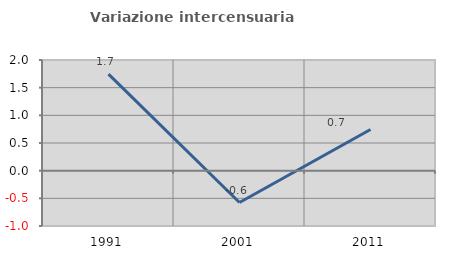
| Category | Variazione intercensuaria annua |
|---|---|
| 1991.0 | 1.745 |
| 2001.0 | -0.575 |
| 2011.0 | 0.745 |